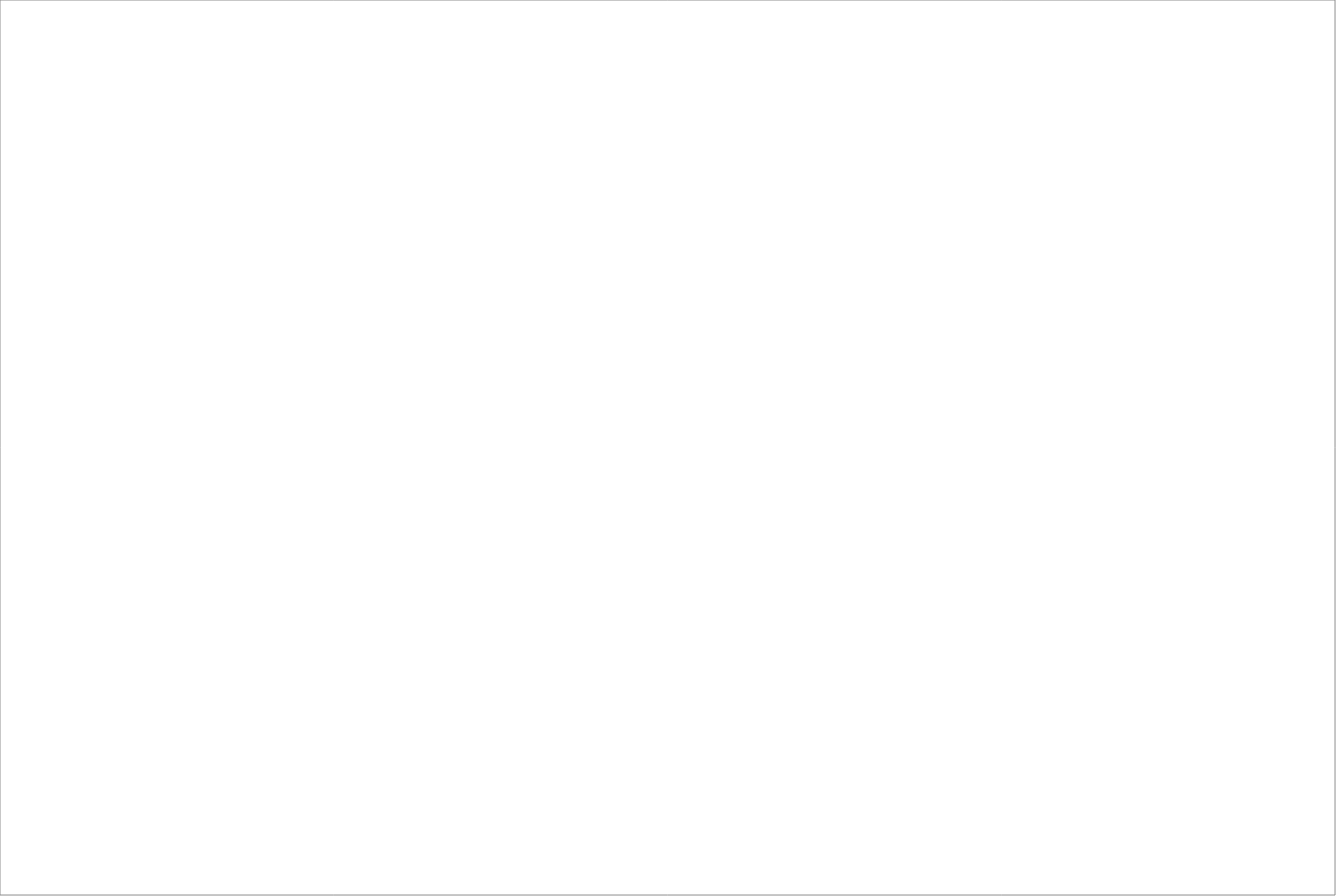
| Category | Total |
|---|---|
| Clockwork Bemanning & Rekrytering AB | 87.5 |
| Randstad AB | 77.5 |
| Poolia Sverige Aktiebolag | 65 |
| StudentConsulting Sweden AB | 65 |
| Academic Work Sweden AB | 62.5 |